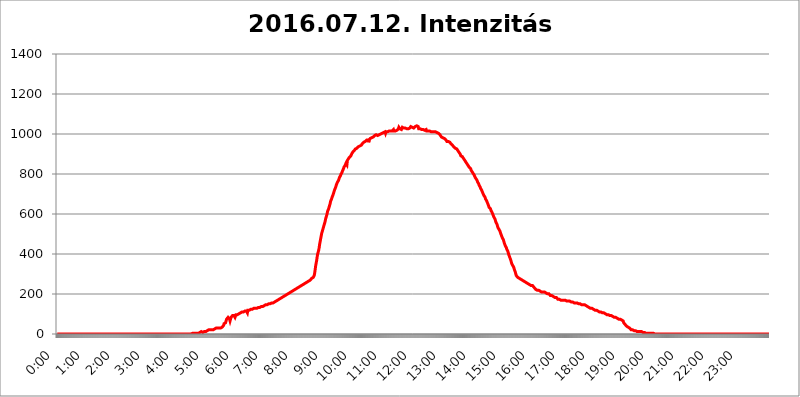
| Category | 2016.07.12. Intenzitás [W/m^2] |
|---|---|
| 0.0 | 0 |
| 0.0006944444444444445 | 0 |
| 0.001388888888888889 | 0 |
| 0.0020833333333333333 | 0 |
| 0.002777777777777778 | 0 |
| 0.003472222222222222 | 0 |
| 0.004166666666666667 | 0 |
| 0.004861111111111111 | 0 |
| 0.005555555555555556 | 0 |
| 0.0062499999999999995 | 0 |
| 0.006944444444444444 | 0 |
| 0.007638888888888889 | 0 |
| 0.008333333333333333 | 0 |
| 0.009027777777777779 | 0 |
| 0.009722222222222222 | 0 |
| 0.010416666666666666 | 0 |
| 0.011111111111111112 | 0 |
| 0.011805555555555555 | 0 |
| 0.012499999999999999 | 0 |
| 0.013194444444444444 | 0 |
| 0.013888888888888888 | 0 |
| 0.014583333333333332 | 0 |
| 0.015277777777777777 | 0 |
| 0.015972222222222224 | 0 |
| 0.016666666666666666 | 0 |
| 0.017361111111111112 | 0 |
| 0.018055555555555557 | 0 |
| 0.01875 | 0 |
| 0.019444444444444445 | 0 |
| 0.02013888888888889 | 0 |
| 0.020833333333333332 | 0 |
| 0.02152777777777778 | 0 |
| 0.022222222222222223 | 0 |
| 0.02291666666666667 | 0 |
| 0.02361111111111111 | 0 |
| 0.024305555555555556 | 0 |
| 0.024999999999999998 | 0 |
| 0.025694444444444447 | 0 |
| 0.02638888888888889 | 0 |
| 0.027083333333333334 | 0 |
| 0.027777777777777776 | 0 |
| 0.02847222222222222 | 0 |
| 0.029166666666666664 | 0 |
| 0.029861111111111113 | 0 |
| 0.030555555555555555 | 0 |
| 0.03125 | 0 |
| 0.03194444444444445 | 0 |
| 0.03263888888888889 | 0 |
| 0.03333333333333333 | 0 |
| 0.034027777777777775 | 0 |
| 0.034722222222222224 | 0 |
| 0.035416666666666666 | 0 |
| 0.036111111111111115 | 0 |
| 0.03680555555555556 | 0 |
| 0.0375 | 0 |
| 0.03819444444444444 | 0 |
| 0.03888888888888889 | 0 |
| 0.03958333333333333 | 0 |
| 0.04027777777777778 | 0 |
| 0.04097222222222222 | 0 |
| 0.041666666666666664 | 0 |
| 0.042361111111111106 | 0 |
| 0.04305555555555556 | 0 |
| 0.043750000000000004 | 0 |
| 0.044444444444444446 | 0 |
| 0.04513888888888889 | 0 |
| 0.04583333333333334 | 0 |
| 0.04652777777777778 | 0 |
| 0.04722222222222222 | 0 |
| 0.04791666666666666 | 0 |
| 0.04861111111111111 | 0 |
| 0.049305555555555554 | 0 |
| 0.049999999999999996 | 0 |
| 0.05069444444444445 | 0 |
| 0.051388888888888894 | 0 |
| 0.052083333333333336 | 0 |
| 0.05277777777777778 | 0 |
| 0.05347222222222222 | 0 |
| 0.05416666666666667 | 0 |
| 0.05486111111111111 | 0 |
| 0.05555555555555555 | 0 |
| 0.05625 | 0 |
| 0.05694444444444444 | 0 |
| 0.057638888888888885 | 0 |
| 0.05833333333333333 | 0 |
| 0.05902777777777778 | 0 |
| 0.059722222222222225 | 0 |
| 0.06041666666666667 | 0 |
| 0.061111111111111116 | 0 |
| 0.06180555555555556 | 0 |
| 0.0625 | 0 |
| 0.06319444444444444 | 0 |
| 0.06388888888888888 | 0 |
| 0.06458333333333334 | 0 |
| 0.06527777777777778 | 0 |
| 0.06597222222222222 | 0 |
| 0.06666666666666667 | 0 |
| 0.06736111111111111 | 0 |
| 0.06805555555555555 | 0 |
| 0.06874999999999999 | 0 |
| 0.06944444444444443 | 0 |
| 0.07013888888888889 | 0 |
| 0.07083333333333333 | 0 |
| 0.07152777777777779 | 0 |
| 0.07222222222222223 | 0 |
| 0.07291666666666667 | 0 |
| 0.07361111111111111 | 0 |
| 0.07430555555555556 | 0 |
| 0.075 | 0 |
| 0.07569444444444444 | 0 |
| 0.0763888888888889 | 0 |
| 0.07708333333333334 | 0 |
| 0.07777777777777778 | 0 |
| 0.07847222222222222 | 0 |
| 0.07916666666666666 | 0 |
| 0.0798611111111111 | 0 |
| 0.08055555555555556 | 0 |
| 0.08125 | 0 |
| 0.08194444444444444 | 0 |
| 0.08263888888888889 | 0 |
| 0.08333333333333333 | 0 |
| 0.08402777777777777 | 0 |
| 0.08472222222222221 | 0 |
| 0.08541666666666665 | 0 |
| 0.08611111111111112 | 0 |
| 0.08680555555555557 | 0 |
| 0.08750000000000001 | 0 |
| 0.08819444444444445 | 0 |
| 0.08888888888888889 | 0 |
| 0.08958333333333333 | 0 |
| 0.09027777777777778 | 0 |
| 0.09097222222222222 | 0 |
| 0.09166666666666667 | 0 |
| 0.09236111111111112 | 0 |
| 0.09305555555555556 | 0 |
| 0.09375 | 0 |
| 0.09444444444444444 | 0 |
| 0.09513888888888888 | 0 |
| 0.09583333333333333 | 0 |
| 0.09652777777777777 | 0 |
| 0.09722222222222222 | 0 |
| 0.09791666666666667 | 0 |
| 0.09861111111111111 | 0 |
| 0.09930555555555555 | 0 |
| 0.09999999999999999 | 0 |
| 0.10069444444444443 | 0 |
| 0.1013888888888889 | 0 |
| 0.10208333333333335 | 0 |
| 0.10277777777777779 | 0 |
| 0.10347222222222223 | 0 |
| 0.10416666666666667 | 0 |
| 0.10486111111111111 | 0 |
| 0.10555555555555556 | 0 |
| 0.10625 | 0 |
| 0.10694444444444444 | 0 |
| 0.1076388888888889 | 0 |
| 0.10833333333333334 | 0 |
| 0.10902777777777778 | 0 |
| 0.10972222222222222 | 0 |
| 0.1111111111111111 | 0 |
| 0.11180555555555556 | 0 |
| 0.11180555555555556 | 0 |
| 0.1125 | 0 |
| 0.11319444444444444 | 0 |
| 0.11388888888888889 | 0 |
| 0.11458333333333333 | 0 |
| 0.11527777777777777 | 0 |
| 0.11597222222222221 | 0 |
| 0.11666666666666665 | 0 |
| 0.1173611111111111 | 0 |
| 0.11805555555555557 | 0 |
| 0.11944444444444445 | 0 |
| 0.12013888888888889 | 0 |
| 0.12083333333333333 | 0 |
| 0.12152777777777778 | 0 |
| 0.12222222222222223 | 0 |
| 0.12291666666666667 | 0 |
| 0.12291666666666667 | 0 |
| 0.12361111111111112 | 0 |
| 0.12430555555555556 | 0 |
| 0.125 | 0 |
| 0.12569444444444444 | 0 |
| 0.12638888888888888 | 0 |
| 0.12708333333333333 | 0 |
| 0.16875 | 0 |
| 0.12847222222222224 | 0 |
| 0.12916666666666668 | 0 |
| 0.12986111111111112 | 0 |
| 0.13055555555555556 | 0 |
| 0.13125 | 0 |
| 0.13194444444444445 | 0 |
| 0.1326388888888889 | 0 |
| 0.13333333333333333 | 0 |
| 0.13402777777777777 | 0 |
| 0.13402777777777777 | 0 |
| 0.13472222222222222 | 0 |
| 0.13541666666666666 | 0 |
| 0.1361111111111111 | 0 |
| 0.13749999999999998 | 0 |
| 0.13819444444444443 | 0 |
| 0.1388888888888889 | 0 |
| 0.13958333333333334 | 0 |
| 0.14027777777777778 | 0 |
| 0.14097222222222222 | 0 |
| 0.14166666666666666 | 0 |
| 0.1423611111111111 | 0 |
| 0.14305555555555557 | 0 |
| 0.14375000000000002 | 0 |
| 0.14444444444444446 | 0 |
| 0.1451388888888889 | 0 |
| 0.1451388888888889 | 0 |
| 0.14652777777777778 | 0 |
| 0.14722222222222223 | 0 |
| 0.14791666666666667 | 0 |
| 0.1486111111111111 | 0 |
| 0.14930555555555555 | 0 |
| 0.15 | 0 |
| 0.15069444444444444 | 0 |
| 0.15138888888888888 | 0 |
| 0.15208333333333332 | 0 |
| 0.15277777777777776 | 0 |
| 0.15347222222222223 | 0 |
| 0.15416666666666667 | 0 |
| 0.15486111111111112 | 0 |
| 0.15555555555555556 | 0 |
| 0.15625 | 0 |
| 0.15694444444444444 | 0 |
| 0.15763888888888888 | 0 |
| 0.15833333333333333 | 0 |
| 0.15902777777777777 | 0 |
| 0.15972222222222224 | 0 |
| 0.16041666666666668 | 0 |
| 0.16111111111111112 | 0 |
| 0.16180555555555556 | 0 |
| 0.1625 | 0 |
| 0.16319444444444445 | 0 |
| 0.1638888888888889 | 0 |
| 0.16458333333333333 | 0 |
| 0.16527777777777777 | 0 |
| 0.16597222222222222 | 0 |
| 0.16666666666666666 | 0 |
| 0.1673611111111111 | 0 |
| 0.16805555555555554 | 0 |
| 0.16874999999999998 | 0 |
| 0.16944444444444443 | 0 |
| 0.17013888888888887 | 0 |
| 0.1708333333333333 | 0 |
| 0.17152777777777775 | 0 |
| 0.17222222222222225 | 0 |
| 0.1729166666666667 | 0 |
| 0.17361111111111113 | 0 |
| 0.17430555555555557 | 0 |
| 0.17500000000000002 | 0 |
| 0.17569444444444446 | 0 |
| 0.1763888888888889 | 0 |
| 0.17708333333333334 | 0 |
| 0.17777777777777778 | 0 |
| 0.17847222222222223 | 0 |
| 0.17916666666666667 | 0 |
| 0.1798611111111111 | 0 |
| 0.18055555555555555 | 0 |
| 0.18125 | 0 |
| 0.18194444444444444 | 0 |
| 0.1826388888888889 | 0 |
| 0.18333333333333335 | 0 |
| 0.1840277777777778 | 0 |
| 0.18472222222222223 | 0 |
| 0.18541666666666667 | 0 |
| 0.18611111111111112 | 0 |
| 0.18680555555555556 | 0 |
| 0.1875 | 0 |
| 0.18819444444444444 | 0 |
| 0.18888888888888888 | 3.525 |
| 0.18958333333333333 | 3.525 |
| 0.19027777777777777 | 3.525 |
| 0.1909722222222222 | 3.525 |
| 0.19166666666666665 | 3.525 |
| 0.19236111111111112 | 3.525 |
| 0.19305555555555554 | 3.525 |
| 0.19375 | 3.525 |
| 0.19444444444444445 | 3.525 |
| 0.1951388888888889 | 3.525 |
| 0.19583333333333333 | 3.525 |
| 0.19652777777777777 | 3.525 |
| 0.19722222222222222 | 3.525 |
| 0.19791666666666666 | 3.525 |
| 0.1986111111111111 | 7.887 |
| 0.19930555555555554 | 7.887 |
| 0.19999999999999998 | 7.887 |
| 0.20069444444444443 | 12.257 |
| 0.20138888888888887 | 12.257 |
| 0.2020833333333333 | 12.257 |
| 0.2027777777777778 | 12.257 |
| 0.2034722222222222 | 7.887 |
| 0.2041666666666667 | 7.887 |
| 0.20486111111111113 | 7.887 |
| 0.20555555555555557 | 12.257 |
| 0.20625000000000002 | 12.257 |
| 0.20694444444444446 | 12.257 |
| 0.2076388888888889 | 12.257 |
| 0.20833333333333334 | 12.257 |
| 0.20902777777777778 | 12.257 |
| 0.20972222222222223 | 16.636 |
| 0.21041666666666667 | 16.636 |
| 0.2111111111111111 | 16.636 |
| 0.21180555555555555 | 16.636 |
| 0.2125 | 21.024 |
| 0.21319444444444444 | 21.024 |
| 0.2138888888888889 | 21.024 |
| 0.21458333333333335 | 21.024 |
| 0.2152777777777778 | 21.024 |
| 0.21597222222222223 | 21.024 |
| 0.21666666666666667 | 21.024 |
| 0.21736111111111112 | 21.024 |
| 0.21805555555555556 | 21.024 |
| 0.21875 | 21.024 |
| 0.21944444444444444 | 21.024 |
| 0.22013888888888888 | 25.419 |
| 0.22083333333333333 | 25.419 |
| 0.22152777777777777 | 25.419 |
| 0.2222222222222222 | 25.419 |
| 0.22291666666666665 | 29.823 |
| 0.2236111111111111 | 29.823 |
| 0.22430555555555556 | 29.823 |
| 0.225 | 29.823 |
| 0.22569444444444445 | 29.823 |
| 0.2263888888888889 | 29.823 |
| 0.22708333333333333 | 29.823 |
| 0.22777777777777777 | 29.823 |
| 0.22847222222222222 | 29.823 |
| 0.22916666666666666 | 29.823 |
| 0.2298611111111111 | 29.823 |
| 0.23055555555555554 | 34.234 |
| 0.23124999999999998 | 34.234 |
| 0.23194444444444443 | 38.653 |
| 0.23263888888888887 | 38.653 |
| 0.2333333333333333 | 43.079 |
| 0.2340277777777778 | 51.951 |
| 0.2347222222222222 | 56.398 |
| 0.2354166666666667 | 56.398 |
| 0.23611111111111113 | 56.398 |
| 0.23680555555555557 | 65.31 |
| 0.23750000000000002 | 74.246 |
| 0.23819444444444446 | 74.246 |
| 0.2388888888888889 | 78.722 |
| 0.23958333333333334 | 83.205 |
| 0.24027777777777778 | 78.722 |
| 0.24097222222222223 | 78.722 |
| 0.24166666666666667 | 74.246 |
| 0.2423611111111111 | 65.31 |
| 0.24305555555555555 | 74.246 |
| 0.24375 | 83.205 |
| 0.24444444444444446 | 87.692 |
| 0.24513888888888888 | 87.692 |
| 0.24583333333333335 | 92.184 |
| 0.2465277777777778 | 87.692 |
| 0.24722222222222223 | 92.184 |
| 0.24791666666666667 | 92.184 |
| 0.24861111111111112 | 87.692 |
| 0.24930555555555556 | 83.205 |
| 0.25 | 83.205 |
| 0.25069444444444444 | 96.682 |
| 0.2513888888888889 | 92.184 |
| 0.2520833333333333 | 92.184 |
| 0.25277777777777777 | 96.682 |
| 0.2534722222222222 | 96.682 |
| 0.25416666666666665 | 101.184 |
| 0.2548611111111111 | 101.184 |
| 0.2555555555555556 | 101.184 |
| 0.25625000000000003 | 105.69 |
| 0.2569444444444445 | 105.69 |
| 0.2576388888888889 | 105.69 |
| 0.25833333333333336 | 110.201 |
| 0.2590277777777778 | 110.201 |
| 0.25972222222222224 | 110.201 |
| 0.2604166666666667 | 110.201 |
| 0.2611111111111111 | 110.201 |
| 0.26180555555555557 | 110.201 |
| 0.2625 | 114.716 |
| 0.26319444444444445 | 114.716 |
| 0.2638888888888889 | 114.716 |
| 0.26458333333333334 | 114.716 |
| 0.2652777777777778 | 114.716 |
| 0.2659722222222222 | 114.716 |
| 0.26666666666666666 | 105.69 |
| 0.2673611111111111 | 119.235 |
| 0.26805555555555555 | 119.235 |
| 0.26875 | 119.235 |
| 0.26944444444444443 | 119.235 |
| 0.2701388888888889 | 119.235 |
| 0.2708333333333333 | 119.235 |
| 0.27152777777777776 | 123.758 |
| 0.2722222222222222 | 123.758 |
| 0.27291666666666664 | 123.758 |
| 0.2736111111111111 | 123.758 |
| 0.2743055555555555 | 123.758 |
| 0.27499999999999997 | 128.284 |
| 0.27569444444444446 | 128.284 |
| 0.27638888888888885 | 128.284 |
| 0.27708333333333335 | 128.284 |
| 0.2777777777777778 | 128.284 |
| 0.27847222222222223 | 128.284 |
| 0.2791666666666667 | 128.284 |
| 0.2798611111111111 | 128.284 |
| 0.28055555555555556 | 132.814 |
| 0.28125 | 132.814 |
| 0.28194444444444444 | 132.814 |
| 0.2826388888888889 | 132.814 |
| 0.2833333333333333 | 132.814 |
| 0.28402777777777777 | 132.814 |
| 0.2847222222222222 | 137.347 |
| 0.28541666666666665 | 137.347 |
| 0.28611111111111115 | 137.347 |
| 0.28680555555555554 | 137.347 |
| 0.28750000000000003 | 137.347 |
| 0.2881944444444445 | 137.347 |
| 0.2888888888888889 | 141.884 |
| 0.28958333333333336 | 141.884 |
| 0.2902777777777778 | 141.884 |
| 0.29097222222222224 | 141.884 |
| 0.2916666666666667 | 141.884 |
| 0.2923611111111111 | 146.423 |
| 0.29305555555555557 | 146.423 |
| 0.29375 | 146.423 |
| 0.29444444444444445 | 146.423 |
| 0.2951388888888889 | 146.423 |
| 0.29583333333333334 | 146.423 |
| 0.2965277777777778 | 150.964 |
| 0.2972222222222222 | 150.964 |
| 0.29791666666666666 | 150.964 |
| 0.2986111111111111 | 150.964 |
| 0.29930555555555555 | 150.964 |
| 0.3 | 155.509 |
| 0.30069444444444443 | 155.509 |
| 0.3013888888888889 | 155.509 |
| 0.3020833333333333 | 155.509 |
| 0.30277777777777776 | 155.509 |
| 0.3034722222222222 | 155.509 |
| 0.30416666666666664 | 160.056 |
| 0.3048611111111111 | 160.056 |
| 0.3055555555555555 | 160.056 |
| 0.30624999999999997 | 160.056 |
| 0.3069444444444444 | 164.605 |
| 0.3076388888888889 | 164.605 |
| 0.30833333333333335 | 164.605 |
| 0.3090277777777778 | 169.156 |
| 0.30972222222222223 | 169.156 |
| 0.3104166666666667 | 169.156 |
| 0.3111111111111111 | 173.709 |
| 0.31180555555555556 | 173.709 |
| 0.3125 | 173.709 |
| 0.31319444444444444 | 178.264 |
| 0.3138888888888889 | 178.264 |
| 0.3145833333333333 | 182.82 |
| 0.31527777777777777 | 182.82 |
| 0.3159722222222222 | 182.82 |
| 0.31666666666666665 | 182.82 |
| 0.31736111111111115 | 187.378 |
| 0.31805555555555554 | 187.378 |
| 0.31875000000000003 | 187.378 |
| 0.3194444444444445 | 191.937 |
| 0.3201388888888889 | 191.937 |
| 0.32083333333333336 | 191.937 |
| 0.3215277777777778 | 196.497 |
| 0.32222222222222224 | 196.497 |
| 0.3229166666666667 | 201.058 |
| 0.3236111111111111 | 201.058 |
| 0.32430555555555557 | 201.058 |
| 0.325 | 205.62 |
| 0.32569444444444445 | 205.62 |
| 0.3263888888888889 | 205.62 |
| 0.32708333333333334 | 210.182 |
| 0.3277777777777778 | 210.182 |
| 0.3284722222222222 | 210.182 |
| 0.32916666666666666 | 210.182 |
| 0.3298611111111111 | 214.746 |
| 0.33055555555555555 | 214.746 |
| 0.33125 | 219.309 |
| 0.33194444444444443 | 219.309 |
| 0.3326388888888889 | 219.309 |
| 0.3333333333333333 | 219.309 |
| 0.3340277777777778 | 223.873 |
| 0.3347222222222222 | 223.873 |
| 0.3354166666666667 | 228.436 |
| 0.3361111111111111 | 228.436 |
| 0.3368055555555556 | 228.436 |
| 0.33749999999999997 | 228.436 |
| 0.33819444444444446 | 233 |
| 0.33888888888888885 | 233 |
| 0.33958333333333335 | 233 |
| 0.34027777777777773 | 237.564 |
| 0.34097222222222223 | 237.564 |
| 0.3416666666666666 | 242.127 |
| 0.3423611111111111 | 242.127 |
| 0.3430555555555555 | 242.127 |
| 0.34375 | 246.689 |
| 0.3444444444444445 | 246.689 |
| 0.3451388888888889 | 246.689 |
| 0.3458333333333334 | 251.251 |
| 0.34652777777777777 | 251.251 |
| 0.34722222222222227 | 251.251 |
| 0.34791666666666665 | 251.251 |
| 0.34861111111111115 | 255.813 |
| 0.34930555555555554 | 255.813 |
| 0.35000000000000003 | 260.373 |
| 0.3506944444444444 | 260.373 |
| 0.3513888888888889 | 260.373 |
| 0.3520833333333333 | 264.932 |
| 0.3527777777777778 | 264.932 |
| 0.3534722222222222 | 269.49 |
| 0.3541666666666667 | 269.49 |
| 0.3548611111111111 | 269.49 |
| 0.35555555555555557 | 274.047 |
| 0.35625 | 274.047 |
| 0.35694444444444445 | 278.603 |
| 0.3576388888888889 | 278.603 |
| 0.35833333333333334 | 278.603 |
| 0.3590277777777778 | 283.156 |
| 0.3597222222222222 | 287.709 |
| 0.36041666666666666 | 292.259 |
| 0.3611111111111111 | 305.898 |
| 0.36180555555555555 | 324.052 |
| 0.3625 | 342.162 |
| 0.36319444444444443 | 355.712 |
| 0.3638888888888889 | 369.23 |
| 0.3645833333333333 | 387.202 |
| 0.3652777777777778 | 400.638 |
| 0.3659722222222222 | 409.574 |
| 0.3666666666666667 | 418.492 |
| 0.3673611111111111 | 431.833 |
| 0.3680555555555556 | 449.551 |
| 0.36874999999999997 | 462.786 |
| 0.36944444444444446 | 475.972 |
| 0.37013888888888885 | 489.108 |
| 0.37083333333333335 | 502.192 |
| 0.37152777777777773 | 510.885 |
| 0.37222222222222223 | 519.555 |
| 0.3729166666666666 | 528.2 |
| 0.3736111111111111 | 536.82 |
| 0.3743055555555555 | 545.416 |
| 0.375 | 553.986 |
| 0.3756944444444445 | 562.53 |
| 0.3763888888888889 | 575.299 |
| 0.3770833333333334 | 583.779 |
| 0.37777777777777777 | 592.233 |
| 0.37847222222222227 | 600.661 |
| 0.37916666666666665 | 613.252 |
| 0.37986111111111115 | 617.436 |
| 0.38055555555555554 | 625.784 |
| 0.38125000000000003 | 634.105 |
| 0.3819444444444444 | 642.4 |
| 0.3826388888888889 | 650.667 |
| 0.3833333333333333 | 663.019 |
| 0.3840277777777778 | 667.123 |
| 0.3847222222222222 | 675.311 |
| 0.3854166666666667 | 683.473 |
| 0.3861111111111111 | 687.544 |
| 0.38680555555555557 | 695.666 |
| 0.3875 | 703.762 |
| 0.38819444444444445 | 711.832 |
| 0.3888888888888889 | 719.877 |
| 0.38958333333333334 | 723.889 |
| 0.3902777777777778 | 731.896 |
| 0.3909722222222222 | 735.89 |
| 0.39166666666666666 | 747.834 |
| 0.3923611111111111 | 751.803 |
| 0.39305555555555555 | 759.723 |
| 0.39375 | 763.674 |
| 0.39444444444444443 | 767.62 |
| 0.3951388888888889 | 775.492 |
| 0.3958333333333333 | 783.342 |
| 0.3965277777777778 | 787.258 |
| 0.3972222222222222 | 791.169 |
| 0.3979166666666667 | 798.974 |
| 0.3986111111111111 | 802.868 |
| 0.3993055555555556 | 806.757 |
| 0.39999999999999997 | 814.519 |
| 0.40069444444444446 | 818.392 |
| 0.40138888888888885 | 826.123 |
| 0.40208333333333335 | 833.834 |
| 0.40277777777777773 | 837.682 |
| 0.40347222222222223 | 841.526 |
| 0.4041666666666666 | 845.365 |
| 0.4048611111111111 | 853.029 |
| 0.4055555555555555 | 853.029 |
| 0.40625 | 845.365 |
| 0.4069444444444445 | 868.305 |
| 0.4076388888888889 | 872.114 |
| 0.4083333333333334 | 875.918 |
| 0.40902777777777777 | 875.918 |
| 0.40972222222222227 | 883.516 |
| 0.41041666666666665 | 883.516 |
| 0.41111111111111115 | 887.309 |
| 0.41180555555555554 | 891.099 |
| 0.41250000000000003 | 894.885 |
| 0.4131944444444444 | 902.447 |
| 0.4138888888888889 | 906.223 |
| 0.4145833333333333 | 909.996 |
| 0.4152777777777778 | 913.766 |
| 0.4159722222222222 | 913.766 |
| 0.4166666666666667 | 917.534 |
| 0.4173611111111111 | 921.298 |
| 0.41805555555555557 | 925.06 |
| 0.41875 | 928.819 |
| 0.41944444444444445 | 925.06 |
| 0.4201388888888889 | 928.819 |
| 0.42083333333333334 | 928.819 |
| 0.4215277777777778 | 932.576 |
| 0.4222222222222222 | 936.33 |
| 0.42291666666666666 | 940.082 |
| 0.4236111111111111 | 940.082 |
| 0.42430555555555555 | 940.082 |
| 0.425 | 943.832 |
| 0.42569444444444443 | 943.832 |
| 0.4263888888888889 | 943.832 |
| 0.4270833333333333 | 947.58 |
| 0.4277777777777778 | 951.327 |
| 0.4284722222222222 | 951.327 |
| 0.4291666666666667 | 955.071 |
| 0.4298611111111111 | 958.814 |
| 0.4305555555555556 | 962.555 |
| 0.43124999999999997 | 962.555 |
| 0.43194444444444446 | 962.555 |
| 0.43263888888888885 | 962.555 |
| 0.43333333333333335 | 966.295 |
| 0.43402777777777773 | 970.034 |
| 0.43472222222222223 | 970.034 |
| 0.4354166666666666 | 973.772 |
| 0.4361111111111111 | 970.034 |
| 0.4368055555555555 | 958.814 |
| 0.4375 | 970.034 |
| 0.4381944444444445 | 973.772 |
| 0.4388888888888889 | 977.508 |
| 0.4395833333333334 | 981.244 |
| 0.44027777777777777 | 981.244 |
| 0.44097222222222227 | 981.244 |
| 0.44166666666666665 | 984.98 |
| 0.44236111111111115 | 984.98 |
| 0.44305555555555554 | 984.98 |
| 0.44375000000000003 | 988.714 |
| 0.4444444444444444 | 988.714 |
| 0.4451388888888889 | 992.448 |
| 0.4458333333333333 | 992.448 |
| 0.4465277777777778 | 996.182 |
| 0.4472222222222222 | 996.182 |
| 0.4479166666666667 | 992.448 |
| 0.4486111111111111 | 992.448 |
| 0.44930555555555557 | 992.448 |
| 0.45 | 996.182 |
| 0.45069444444444445 | 996.182 |
| 0.4513888888888889 | 996.182 |
| 0.45208333333333334 | 992.448 |
| 0.4527777777777778 | 992.448 |
| 0.4534722222222222 | 999.916 |
| 0.45416666666666666 | 1003.65 |
| 0.4548611111111111 | 999.916 |
| 0.45555555555555555 | 1003.65 |
| 0.45625 | 1007.383 |
| 0.45694444444444443 | 1007.383 |
| 0.4576388888888889 | 1007.383 |
| 0.4583333333333333 | 1007.383 |
| 0.4590277777777778 | 1007.383 |
| 0.4597222222222222 | 1011.118 |
| 0.4604166666666667 | 1003.65 |
| 0.4611111111111111 | 1011.118 |
| 0.4618055555555556 | 1011.118 |
| 0.46249999999999997 | 1014.852 |
| 0.46319444444444446 | 1011.118 |
| 0.46388888888888885 | 1011.118 |
| 0.46458333333333335 | 1014.852 |
| 0.46527777777777773 | 1014.852 |
| 0.46597222222222223 | 1014.852 |
| 0.4666666666666666 | 1014.852 |
| 0.4673611111111111 | 1014.852 |
| 0.4680555555555555 | 1014.852 |
| 0.46875 | 1014.852 |
| 0.4694444444444445 | 1014.852 |
| 0.4701388888888889 | 1011.118 |
| 0.4708333333333334 | 1018.587 |
| 0.47152777777777777 | 1022.323 |
| 0.47222222222222227 | 1014.852 |
| 0.47291666666666665 | 1018.587 |
| 0.47361111111111115 | 1014.852 |
| 0.47430555555555554 | 1014.852 |
| 0.47500000000000003 | 1011.118 |
| 0.4756944444444444 | 1011.118 |
| 0.4763888888888889 | 1018.587 |
| 0.4770833333333333 | 1018.587 |
| 0.4777777777777778 | 1018.587 |
| 0.4784722222222222 | 1026.06 |
| 0.4791666666666667 | 1033.537 |
| 0.4798611111111111 | 1029.798 |
| 0.48055555555555557 | 1026.06 |
| 0.48125 | 1026.06 |
| 0.48194444444444445 | 1026.06 |
| 0.4826388888888889 | 1022.323 |
| 0.48333333333333334 | 1022.323 |
| 0.4840277777777778 | 1033.537 |
| 0.4847222222222222 | 1033.537 |
| 0.48541666666666666 | 1029.798 |
| 0.4861111111111111 | 1029.798 |
| 0.48680555555555555 | 1029.798 |
| 0.4875 | 1033.537 |
| 0.48819444444444443 | 1029.798 |
| 0.4888888888888889 | 1026.06 |
| 0.4895833333333333 | 1026.06 |
| 0.4902777777777778 | 1026.06 |
| 0.4909722222222222 | 1026.06 |
| 0.4916666666666667 | 1026.06 |
| 0.4923611111111111 | 1026.06 |
| 0.4930555555555556 | 1029.798 |
| 0.49374999999999997 | 1029.798 |
| 0.49444444444444446 | 1029.798 |
| 0.49513888888888885 | 1033.537 |
| 0.49583333333333335 | 1037.277 |
| 0.49652777777777773 | 1037.277 |
| 0.49722222222222223 | 1037.277 |
| 0.4979166666666666 | 1033.537 |
| 0.4986111111111111 | 1029.798 |
| 0.4993055555555555 | 1029.798 |
| 0.5 | 1029.798 |
| 0.5006944444444444 | 1033.537 |
| 0.5013888888888889 | 1033.537 |
| 0.5020833333333333 | 1037.277 |
| 0.5027777777777778 | 1041.019 |
| 0.5034722222222222 | 1041.019 |
| 0.5041666666666667 | 1041.019 |
| 0.5048611111111111 | 1041.019 |
| 0.5055555555555555 | 1041.019 |
| 0.50625 | 1037.277 |
| 0.5069444444444444 | 1026.06 |
| 0.5076388888888889 | 1026.06 |
| 0.5083333333333333 | 1026.06 |
| 0.5090277777777777 | 1026.06 |
| 0.5097222222222222 | 1022.323 |
| 0.5104166666666666 | 1022.323 |
| 0.5111111111111112 | 1022.323 |
| 0.5118055555555555 | 1022.323 |
| 0.5125000000000001 | 1018.587 |
| 0.5131944444444444 | 1022.323 |
| 0.513888888888889 | 1018.587 |
| 0.5145833333333333 | 1018.587 |
| 0.5152777777777778 | 1018.587 |
| 0.5159722222222222 | 1022.323 |
| 0.5166666666666667 | 1022.323 |
| 0.517361111111111 | 1022.323 |
| 0.5180555555555556 | 1014.852 |
| 0.5187499999999999 | 1014.852 |
| 0.5194444444444445 | 1011.118 |
| 0.5201388888888888 | 1014.852 |
| 0.5208333333333334 | 1014.852 |
| 0.5215277777777778 | 1014.852 |
| 0.5222222222222223 | 1014.852 |
| 0.5229166666666667 | 1014.852 |
| 0.5236111111111111 | 1018.587 |
| 0.5243055555555556 | 1011.118 |
| 0.525 | 1007.383 |
| 0.5256944444444445 | 1011.118 |
| 0.5263888888888889 | 1011.118 |
| 0.5270833333333333 | 1007.383 |
| 0.5277777777777778 | 1011.118 |
| 0.5284722222222222 | 1011.118 |
| 0.5291666666666667 | 1007.383 |
| 0.5298611111111111 | 1007.383 |
| 0.5305555555555556 | 1011.118 |
| 0.53125 | 1007.383 |
| 0.5319444444444444 | 1007.383 |
| 0.5326388888888889 | 1007.383 |
| 0.5333333333333333 | 1007.383 |
| 0.5340277777777778 | 1003.65 |
| 0.5347222222222222 | 1003.65 |
| 0.5354166666666667 | 999.916 |
| 0.5361111111111111 | 999.916 |
| 0.5368055555555555 | 996.182 |
| 0.5375 | 992.448 |
| 0.5381944444444444 | 992.448 |
| 0.5388888888888889 | 984.98 |
| 0.5395833333333333 | 981.244 |
| 0.5402777777777777 | 981.244 |
| 0.5409722222222222 | 981.244 |
| 0.5416666666666666 | 981.244 |
| 0.5423611111111112 | 977.508 |
| 0.5430555555555555 | 977.508 |
| 0.5437500000000001 | 977.508 |
| 0.5444444444444444 | 973.772 |
| 0.545138888888889 | 970.034 |
| 0.5458333333333333 | 970.034 |
| 0.5465277777777778 | 962.555 |
| 0.5472222222222222 | 962.555 |
| 0.5479166666666667 | 962.555 |
| 0.548611111111111 | 962.555 |
| 0.5493055555555556 | 958.814 |
| 0.5499999999999999 | 962.555 |
| 0.5506944444444445 | 958.814 |
| 0.5513888888888888 | 955.071 |
| 0.5520833333333334 | 951.327 |
| 0.5527777777777778 | 947.58 |
| 0.5534722222222223 | 947.58 |
| 0.5541666666666667 | 943.832 |
| 0.5548611111111111 | 940.082 |
| 0.5555555555555556 | 940.082 |
| 0.55625 | 936.33 |
| 0.5569444444444445 | 936.33 |
| 0.5576388888888889 | 932.576 |
| 0.5583333333333333 | 928.819 |
| 0.5590277777777778 | 925.06 |
| 0.5597222222222222 | 925.06 |
| 0.5604166666666667 | 925.06 |
| 0.5611111111111111 | 921.298 |
| 0.5618055555555556 | 917.534 |
| 0.5625 | 913.766 |
| 0.5631944444444444 | 909.996 |
| 0.5638888888888889 | 913.766 |
| 0.5645833333333333 | 906.223 |
| 0.5652777777777778 | 898.668 |
| 0.5659722222222222 | 891.099 |
| 0.5666666666666667 | 891.099 |
| 0.5673611111111111 | 891.099 |
| 0.5680555555555555 | 887.309 |
| 0.56875 | 883.516 |
| 0.5694444444444444 | 879.719 |
| 0.5701388888888889 | 875.918 |
| 0.5708333333333333 | 872.114 |
| 0.5715277777777777 | 868.305 |
| 0.5722222222222222 | 864.493 |
| 0.5729166666666666 | 860.676 |
| 0.5736111111111112 | 856.855 |
| 0.5743055555555555 | 853.029 |
| 0.5750000000000001 | 849.199 |
| 0.5756944444444444 | 845.365 |
| 0.576388888888889 | 841.526 |
| 0.5770833333333333 | 837.682 |
| 0.5777777777777778 | 833.834 |
| 0.5784722222222222 | 833.834 |
| 0.5791666666666667 | 829.981 |
| 0.579861111111111 | 826.123 |
| 0.5805555555555556 | 818.392 |
| 0.5812499999999999 | 814.519 |
| 0.5819444444444445 | 810.641 |
| 0.5826388888888888 | 806.757 |
| 0.5833333333333334 | 802.868 |
| 0.5840277777777778 | 798.974 |
| 0.5847222222222223 | 795.074 |
| 0.5854166666666667 | 791.169 |
| 0.5861111111111111 | 783.342 |
| 0.5868055555555556 | 779.42 |
| 0.5875 | 775.492 |
| 0.5881944444444445 | 771.559 |
| 0.5888888888888889 | 767.62 |
| 0.5895833333333333 | 759.723 |
| 0.5902777777777778 | 755.766 |
| 0.5909722222222222 | 751.803 |
| 0.5916666666666667 | 743.859 |
| 0.5923611111111111 | 739.877 |
| 0.5930555555555556 | 735.89 |
| 0.59375 | 727.896 |
| 0.5944444444444444 | 723.889 |
| 0.5951388888888889 | 719.877 |
| 0.5958333333333333 | 715.858 |
| 0.5965277777777778 | 707.8 |
| 0.5972222222222222 | 703.762 |
| 0.5979166666666667 | 695.666 |
| 0.5986111111111111 | 691.608 |
| 0.5993055555555555 | 691.608 |
| 0.6 | 683.473 |
| 0.6006944444444444 | 675.311 |
| 0.6013888888888889 | 671.22 |
| 0.6020833333333333 | 667.123 |
| 0.6027777777777777 | 663.019 |
| 0.6034722222222222 | 654.791 |
| 0.6041666666666666 | 650.667 |
| 0.6048611111111112 | 642.4 |
| 0.6055555555555555 | 634.105 |
| 0.6062500000000001 | 634.105 |
| 0.6069444444444444 | 629.948 |
| 0.607638888888889 | 625.784 |
| 0.6083333333333333 | 617.436 |
| 0.6090277777777778 | 613.252 |
| 0.6097222222222222 | 609.062 |
| 0.6104166666666667 | 604.864 |
| 0.611111111111111 | 596.45 |
| 0.6118055555555556 | 592.233 |
| 0.6124999999999999 | 583.779 |
| 0.6131944444444445 | 579.542 |
| 0.6138888888888888 | 575.299 |
| 0.6145833333333334 | 566.793 |
| 0.6152777777777778 | 558.261 |
| 0.6159722222222223 | 553.986 |
| 0.6166666666666667 | 549.704 |
| 0.6173611111111111 | 541.121 |
| 0.6180555555555556 | 532.513 |
| 0.61875 | 528.2 |
| 0.6194444444444445 | 523.88 |
| 0.6201388888888889 | 519.555 |
| 0.6208333333333333 | 515.223 |
| 0.6215277777777778 | 506.542 |
| 0.6222222222222222 | 502.192 |
| 0.6229166666666667 | 493.475 |
| 0.6236111111111111 | 489.108 |
| 0.6243055555555556 | 480.356 |
| 0.625 | 475.972 |
| 0.6256944444444444 | 471.582 |
| 0.6263888888888889 | 462.786 |
| 0.6270833333333333 | 453.968 |
| 0.6277777777777778 | 449.551 |
| 0.6284722222222222 | 440.702 |
| 0.6291666666666667 | 436.27 |
| 0.6298611111111111 | 431.833 |
| 0.6305555555555555 | 422.943 |
| 0.63125 | 418.492 |
| 0.6319444444444444 | 414.035 |
| 0.6326388888888889 | 405.108 |
| 0.6333333333333333 | 396.164 |
| 0.6340277777777777 | 391.685 |
| 0.6347222222222222 | 382.715 |
| 0.6354166666666666 | 378.224 |
| 0.6361111111111112 | 369.23 |
| 0.6368055555555555 | 360.221 |
| 0.6375000000000001 | 351.198 |
| 0.6381944444444444 | 346.682 |
| 0.638888888888889 | 342.162 |
| 0.6395833333333333 | 337.639 |
| 0.6402777777777778 | 333.113 |
| 0.6409722222222222 | 324.052 |
| 0.6416666666666667 | 319.517 |
| 0.642361111111111 | 310.44 |
| 0.6430555555555556 | 301.354 |
| 0.6437499999999999 | 292.259 |
| 0.6444444444444445 | 287.709 |
| 0.6451388888888888 | 287.709 |
| 0.6458333333333334 | 283.156 |
| 0.6465277777777778 | 283.156 |
| 0.6472222222222223 | 278.603 |
| 0.6479166666666667 | 278.603 |
| 0.6486111111111111 | 278.603 |
| 0.6493055555555556 | 274.047 |
| 0.65 | 274.047 |
| 0.6506944444444445 | 274.047 |
| 0.6513888888888889 | 274.047 |
| 0.6520833333333333 | 269.49 |
| 0.6527777777777778 | 269.49 |
| 0.6534722222222222 | 269.49 |
| 0.6541666666666667 | 264.932 |
| 0.6548611111111111 | 264.932 |
| 0.6555555555555556 | 264.932 |
| 0.65625 | 260.373 |
| 0.6569444444444444 | 260.373 |
| 0.6576388888888889 | 260.373 |
| 0.6583333333333333 | 255.813 |
| 0.6590277777777778 | 255.813 |
| 0.6597222222222222 | 255.813 |
| 0.6604166666666667 | 251.251 |
| 0.6611111111111111 | 251.251 |
| 0.6618055555555555 | 251.251 |
| 0.6625 | 246.689 |
| 0.6631944444444444 | 246.689 |
| 0.6638888888888889 | 242.127 |
| 0.6645833333333333 | 242.127 |
| 0.6652777777777777 | 242.127 |
| 0.6659722222222222 | 242.127 |
| 0.6666666666666666 | 242.127 |
| 0.6673611111111111 | 242.127 |
| 0.6680555555555556 | 242.127 |
| 0.6687500000000001 | 233 |
| 0.6694444444444444 | 228.436 |
| 0.6701388888888888 | 228.436 |
| 0.6708333333333334 | 223.873 |
| 0.6715277777777778 | 223.873 |
| 0.6722222222222222 | 219.309 |
| 0.6729166666666666 | 219.309 |
| 0.6736111111111112 | 219.309 |
| 0.6743055555555556 | 214.746 |
| 0.6749999999999999 | 219.309 |
| 0.6756944444444444 | 214.746 |
| 0.6763888888888889 | 214.746 |
| 0.6770833333333334 | 214.746 |
| 0.6777777777777777 | 214.746 |
| 0.6784722222222223 | 214.746 |
| 0.6791666666666667 | 210.182 |
| 0.6798611111111111 | 210.182 |
| 0.6805555555555555 | 210.182 |
| 0.68125 | 210.182 |
| 0.6819444444444445 | 210.182 |
| 0.6826388888888889 | 210.182 |
| 0.6833333333333332 | 210.182 |
| 0.6840277777777778 | 210.182 |
| 0.6847222222222222 | 205.62 |
| 0.6854166666666667 | 205.62 |
| 0.686111111111111 | 205.62 |
| 0.6868055555555556 | 205.62 |
| 0.6875 | 201.058 |
| 0.6881944444444444 | 201.058 |
| 0.688888888888889 | 201.058 |
| 0.6895833333333333 | 201.058 |
| 0.6902777777777778 | 196.497 |
| 0.6909722222222222 | 196.497 |
| 0.6916666666666668 | 191.937 |
| 0.6923611111111111 | 191.937 |
| 0.6930555555555555 | 191.937 |
| 0.69375 | 191.937 |
| 0.6944444444444445 | 187.378 |
| 0.6951388888888889 | 187.378 |
| 0.6958333333333333 | 187.378 |
| 0.6965277777777777 | 187.378 |
| 0.6972222222222223 | 182.82 |
| 0.6979166666666666 | 182.82 |
| 0.6986111111111111 | 182.82 |
| 0.6993055555555556 | 182.82 |
| 0.7000000000000001 | 182.82 |
| 0.7006944444444444 | 178.264 |
| 0.7013888888888888 | 178.264 |
| 0.7020833333333334 | 173.709 |
| 0.7027777777777778 | 173.709 |
| 0.7034722222222222 | 173.709 |
| 0.7041666666666666 | 173.709 |
| 0.7048611111111112 | 169.156 |
| 0.7055555555555556 | 169.156 |
| 0.7062499999999999 | 169.156 |
| 0.7069444444444444 | 169.156 |
| 0.7076388888888889 | 169.156 |
| 0.7083333333333334 | 169.156 |
| 0.7090277777777777 | 169.156 |
| 0.7097222222222223 | 169.156 |
| 0.7104166666666667 | 169.156 |
| 0.7111111111111111 | 164.605 |
| 0.7118055555555555 | 164.605 |
| 0.7125 | 169.156 |
| 0.7131944444444445 | 164.605 |
| 0.7138888888888889 | 164.605 |
| 0.7145833333333332 | 164.605 |
| 0.7152777777777778 | 164.605 |
| 0.7159722222222222 | 164.605 |
| 0.7166666666666667 | 164.605 |
| 0.717361111111111 | 164.605 |
| 0.7180555555555556 | 164.605 |
| 0.71875 | 164.605 |
| 0.7194444444444444 | 160.056 |
| 0.720138888888889 | 160.056 |
| 0.7208333333333333 | 160.056 |
| 0.7215277777777778 | 160.056 |
| 0.7222222222222222 | 160.056 |
| 0.7229166666666668 | 160.056 |
| 0.7236111111111111 | 160.056 |
| 0.7243055555555555 | 155.509 |
| 0.725 | 155.509 |
| 0.7256944444444445 | 155.509 |
| 0.7263888888888889 | 155.509 |
| 0.7270833333333333 | 155.509 |
| 0.7277777777777777 | 155.509 |
| 0.7284722222222223 | 155.509 |
| 0.7291666666666666 | 155.509 |
| 0.7298611111111111 | 150.964 |
| 0.7305555555555556 | 150.964 |
| 0.7312500000000001 | 150.964 |
| 0.7319444444444444 | 150.964 |
| 0.7326388888888888 | 150.964 |
| 0.7333333333333334 | 150.964 |
| 0.7340277777777778 | 150.964 |
| 0.7347222222222222 | 146.423 |
| 0.7354166666666666 | 146.423 |
| 0.7361111111111112 | 146.423 |
| 0.7368055555555556 | 146.423 |
| 0.7374999999999999 | 146.423 |
| 0.7381944444444444 | 146.423 |
| 0.7388888888888889 | 146.423 |
| 0.7395833333333334 | 146.423 |
| 0.7402777777777777 | 141.884 |
| 0.7409722222222223 | 141.884 |
| 0.7416666666666667 | 141.884 |
| 0.7423611111111111 | 137.347 |
| 0.7430555555555555 | 137.347 |
| 0.74375 | 137.347 |
| 0.7444444444444445 | 137.347 |
| 0.7451388888888889 | 132.814 |
| 0.7458333333333332 | 132.814 |
| 0.7465277777777778 | 132.814 |
| 0.7472222222222222 | 132.814 |
| 0.7479166666666667 | 128.284 |
| 0.748611111111111 | 128.284 |
| 0.7493055555555556 | 128.284 |
| 0.75 | 128.284 |
| 0.7506944444444444 | 123.758 |
| 0.751388888888889 | 123.758 |
| 0.7520833333333333 | 123.758 |
| 0.7527777777777778 | 123.758 |
| 0.7534722222222222 | 119.235 |
| 0.7541666666666668 | 119.235 |
| 0.7548611111111111 | 119.235 |
| 0.7555555555555555 | 119.235 |
| 0.75625 | 119.235 |
| 0.7569444444444445 | 114.716 |
| 0.7576388888888889 | 114.716 |
| 0.7583333333333333 | 114.716 |
| 0.7590277777777777 | 114.716 |
| 0.7597222222222223 | 114.716 |
| 0.7604166666666666 | 110.201 |
| 0.7611111111111111 | 110.201 |
| 0.7618055555555556 | 110.201 |
| 0.7625000000000001 | 110.201 |
| 0.7631944444444444 | 110.201 |
| 0.7638888888888888 | 105.69 |
| 0.7645833333333334 | 105.69 |
| 0.7652777777777778 | 105.69 |
| 0.7659722222222222 | 105.69 |
| 0.7666666666666666 | 105.69 |
| 0.7673611111111112 | 101.184 |
| 0.7680555555555556 | 101.184 |
| 0.7687499999999999 | 101.184 |
| 0.7694444444444444 | 101.184 |
| 0.7701388888888889 | 96.682 |
| 0.7708333333333334 | 96.682 |
| 0.7715277777777777 | 96.682 |
| 0.7722222222222223 | 96.682 |
| 0.7729166666666667 | 96.682 |
| 0.7736111111111111 | 92.184 |
| 0.7743055555555555 | 92.184 |
| 0.775 | 92.184 |
| 0.7756944444444445 | 92.184 |
| 0.7763888888888889 | 92.184 |
| 0.7770833333333332 | 92.184 |
| 0.7777777777777778 | 87.692 |
| 0.7784722222222222 | 87.692 |
| 0.7791666666666667 | 87.692 |
| 0.779861111111111 | 87.692 |
| 0.7805555555555556 | 83.205 |
| 0.78125 | 83.205 |
| 0.7819444444444444 | 83.205 |
| 0.782638888888889 | 83.205 |
| 0.7833333333333333 | 83.205 |
| 0.7840277777777778 | 83.205 |
| 0.7847222222222222 | 78.722 |
| 0.7854166666666668 | 78.722 |
| 0.7861111111111111 | 78.722 |
| 0.7868055555555555 | 78.722 |
| 0.7875 | 74.246 |
| 0.7881944444444445 | 74.246 |
| 0.7888888888888889 | 74.246 |
| 0.7895833333333333 | 74.246 |
| 0.7902777777777777 | 69.775 |
| 0.7909722222222223 | 69.775 |
| 0.7916666666666666 | 69.775 |
| 0.7923611111111111 | 69.775 |
| 0.7930555555555556 | 65.31 |
| 0.7937500000000001 | 65.31 |
| 0.7944444444444444 | 56.398 |
| 0.7951388888888888 | 56.398 |
| 0.7958333333333334 | 51.951 |
| 0.7965277777777778 | 47.511 |
| 0.7972222222222222 | 43.079 |
| 0.7979166666666666 | 43.079 |
| 0.7986111111111112 | 38.653 |
| 0.7993055555555556 | 38.653 |
| 0.7999999999999999 | 34.234 |
| 0.8006944444444444 | 34.234 |
| 0.8013888888888889 | 29.823 |
| 0.8020833333333334 | 29.823 |
| 0.8027777777777777 | 29.823 |
| 0.8034722222222223 | 25.419 |
| 0.8041666666666667 | 25.419 |
| 0.8048611111111111 | 21.024 |
| 0.8055555555555555 | 21.024 |
| 0.80625 | 21.024 |
| 0.8069444444444445 | 21.024 |
| 0.8076388888888889 | 16.636 |
| 0.8083333333333332 | 16.636 |
| 0.8090277777777778 | 16.636 |
| 0.8097222222222222 | 16.636 |
| 0.8104166666666667 | 16.636 |
| 0.811111111111111 | 16.636 |
| 0.8118055555555556 | 12.257 |
| 0.8125 | 12.257 |
| 0.8131944444444444 | 12.257 |
| 0.813888888888889 | 12.257 |
| 0.8145833333333333 | 12.257 |
| 0.8152777777777778 | 12.257 |
| 0.8159722222222222 | 12.257 |
| 0.8166666666666668 | 12.257 |
| 0.8173611111111111 | 12.257 |
| 0.8180555555555555 | 12.257 |
| 0.81875 | 7.887 |
| 0.8194444444444445 | 12.257 |
| 0.8201388888888889 | 7.887 |
| 0.8208333333333333 | 7.887 |
| 0.8215277777777777 | 7.887 |
| 0.8222222222222223 | 7.887 |
| 0.8229166666666666 | 7.887 |
| 0.8236111111111111 | 7.887 |
| 0.8243055555555556 | 7.887 |
| 0.8250000000000001 | 7.887 |
| 0.8256944444444444 | 3.525 |
| 0.8263888888888888 | 3.525 |
| 0.8270833333333334 | 3.525 |
| 0.8277777777777778 | 3.525 |
| 0.8284722222222222 | 3.525 |
| 0.8291666666666666 | 3.525 |
| 0.8298611111111112 | 3.525 |
| 0.8305555555555556 | 3.525 |
| 0.8312499999999999 | 3.525 |
| 0.8319444444444444 | 3.525 |
| 0.8326388888888889 | 3.525 |
| 0.8333333333333334 | 3.525 |
| 0.8340277777777777 | 3.525 |
| 0.8347222222222223 | 3.525 |
| 0.8354166666666667 | 3.525 |
| 0.8361111111111111 | 3.525 |
| 0.8368055555555555 | 0 |
| 0.8375 | 3.525 |
| 0.8381944444444445 | 0 |
| 0.8388888888888889 | 0 |
| 0.8395833333333332 | 0 |
| 0.8402777777777778 | 0 |
| 0.8409722222222222 | 0 |
| 0.8416666666666667 | 0 |
| 0.842361111111111 | 0 |
| 0.8430555555555556 | 0 |
| 0.84375 | 0 |
| 0.8444444444444444 | 0 |
| 0.845138888888889 | 0 |
| 0.8458333333333333 | 0 |
| 0.8465277777777778 | 0 |
| 0.8472222222222222 | 0 |
| 0.8479166666666668 | 0 |
| 0.8486111111111111 | 0 |
| 0.8493055555555555 | 0 |
| 0.85 | 0 |
| 0.8506944444444445 | 0 |
| 0.8513888888888889 | 0 |
| 0.8520833333333333 | 0 |
| 0.8527777777777777 | 0 |
| 0.8534722222222223 | 0 |
| 0.8541666666666666 | 0 |
| 0.8548611111111111 | 0 |
| 0.8555555555555556 | 0 |
| 0.8562500000000001 | 0 |
| 0.8569444444444444 | 0 |
| 0.8576388888888888 | 0 |
| 0.8583333333333334 | 0 |
| 0.8590277777777778 | 0 |
| 0.8597222222222222 | 0 |
| 0.8604166666666666 | 0 |
| 0.8611111111111112 | 0 |
| 0.8618055555555556 | 0 |
| 0.8624999999999999 | 0 |
| 0.8631944444444444 | 0 |
| 0.8638888888888889 | 0 |
| 0.8645833333333334 | 0 |
| 0.8652777777777777 | 0 |
| 0.8659722222222223 | 0 |
| 0.8666666666666667 | 0 |
| 0.8673611111111111 | 0 |
| 0.8680555555555555 | 0 |
| 0.86875 | 0 |
| 0.8694444444444445 | 0 |
| 0.8701388888888889 | 0 |
| 0.8708333333333332 | 0 |
| 0.8715277777777778 | 0 |
| 0.8722222222222222 | 0 |
| 0.8729166666666667 | 0 |
| 0.873611111111111 | 0 |
| 0.8743055555555556 | 0 |
| 0.875 | 0 |
| 0.8756944444444444 | 0 |
| 0.876388888888889 | 0 |
| 0.8770833333333333 | 0 |
| 0.8777777777777778 | 0 |
| 0.8784722222222222 | 0 |
| 0.8791666666666668 | 0 |
| 0.8798611111111111 | 0 |
| 0.8805555555555555 | 0 |
| 0.88125 | 0 |
| 0.8819444444444445 | 0 |
| 0.8826388888888889 | 0 |
| 0.8833333333333333 | 0 |
| 0.8840277777777777 | 0 |
| 0.8847222222222223 | 0 |
| 0.8854166666666666 | 0 |
| 0.8861111111111111 | 0 |
| 0.8868055555555556 | 0 |
| 0.8875000000000001 | 0 |
| 0.8881944444444444 | 0 |
| 0.8888888888888888 | 0 |
| 0.8895833333333334 | 0 |
| 0.8902777777777778 | 0 |
| 0.8909722222222222 | 0 |
| 0.8916666666666666 | 0 |
| 0.8923611111111112 | 0 |
| 0.8930555555555556 | 0 |
| 0.8937499999999999 | 0 |
| 0.8944444444444444 | 0 |
| 0.8951388888888889 | 0 |
| 0.8958333333333334 | 0 |
| 0.8965277777777777 | 0 |
| 0.8972222222222223 | 0 |
| 0.8979166666666667 | 0 |
| 0.8986111111111111 | 0 |
| 0.8993055555555555 | 0 |
| 0.9 | 0 |
| 0.9006944444444445 | 0 |
| 0.9013888888888889 | 0 |
| 0.9020833333333332 | 0 |
| 0.9027777777777778 | 0 |
| 0.9034722222222222 | 0 |
| 0.9041666666666667 | 0 |
| 0.904861111111111 | 0 |
| 0.9055555555555556 | 0 |
| 0.90625 | 0 |
| 0.9069444444444444 | 0 |
| 0.907638888888889 | 0 |
| 0.9083333333333333 | 0 |
| 0.9090277777777778 | 0 |
| 0.9097222222222222 | 0 |
| 0.9104166666666668 | 0 |
| 0.9111111111111111 | 0 |
| 0.9118055555555555 | 0 |
| 0.9125 | 0 |
| 0.9131944444444445 | 0 |
| 0.9138888888888889 | 0 |
| 0.9145833333333333 | 0 |
| 0.9152777777777777 | 0 |
| 0.9159722222222223 | 0 |
| 0.9166666666666666 | 0 |
| 0.9173611111111111 | 0 |
| 0.9180555555555556 | 0 |
| 0.9187500000000001 | 0 |
| 0.9194444444444444 | 0 |
| 0.9201388888888888 | 0 |
| 0.9208333333333334 | 0 |
| 0.9215277777777778 | 0 |
| 0.9222222222222222 | 0 |
| 0.9229166666666666 | 0 |
| 0.9236111111111112 | 0 |
| 0.9243055555555556 | 0 |
| 0.9249999999999999 | 0 |
| 0.9256944444444444 | 0 |
| 0.9263888888888889 | 0 |
| 0.9270833333333334 | 0 |
| 0.9277777777777777 | 0 |
| 0.9284722222222223 | 0 |
| 0.9291666666666667 | 0 |
| 0.9298611111111111 | 0 |
| 0.9305555555555555 | 0 |
| 0.93125 | 0 |
| 0.9319444444444445 | 0 |
| 0.9326388888888889 | 0 |
| 0.9333333333333332 | 0 |
| 0.9340277777777778 | 0 |
| 0.9347222222222222 | 0 |
| 0.9354166666666667 | 0 |
| 0.936111111111111 | 0 |
| 0.9368055555555556 | 0 |
| 0.9375 | 0 |
| 0.9381944444444444 | 0 |
| 0.938888888888889 | 0 |
| 0.9395833333333333 | 0 |
| 0.9402777777777778 | 0 |
| 0.9409722222222222 | 0 |
| 0.9416666666666668 | 0 |
| 0.9423611111111111 | 0 |
| 0.9430555555555555 | 0 |
| 0.94375 | 0 |
| 0.9444444444444445 | 0 |
| 0.9451388888888889 | 0 |
| 0.9458333333333333 | 0 |
| 0.9465277777777777 | 0 |
| 0.9472222222222223 | 0 |
| 0.9479166666666666 | 0 |
| 0.9486111111111111 | 0 |
| 0.9493055555555556 | 0 |
| 0.9500000000000001 | 0 |
| 0.9506944444444444 | 0 |
| 0.9513888888888888 | 0 |
| 0.9520833333333334 | 0 |
| 0.9527777777777778 | 0 |
| 0.9534722222222222 | 0 |
| 0.9541666666666666 | 0 |
| 0.9548611111111112 | 0 |
| 0.9555555555555556 | 0 |
| 0.9562499999999999 | 0 |
| 0.9569444444444444 | 0 |
| 0.9576388888888889 | 0 |
| 0.9583333333333334 | 0 |
| 0.9590277777777777 | 0 |
| 0.9597222222222223 | 0 |
| 0.9604166666666667 | 0 |
| 0.9611111111111111 | 0 |
| 0.9618055555555555 | 0 |
| 0.9625 | 0 |
| 0.9631944444444445 | 0 |
| 0.9638888888888889 | 0 |
| 0.9645833333333332 | 0 |
| 0.9652777777777778 | 0 |
| 0.9659722222222222 | 0 |
| 0.9666666666666667 | 0 |
| 0.967361111111111 | 0 |
| 0.9680555555555556 | 0 |
| 0.96875 | 0 |
| 0.9694444444444444 | 0 |
| 0.970138888888889 | 0 |
| 0.9708333333333333 | 0 |
| 0.9715277777777778 | 0 |
| 0.9722222222222222 | 0 |
| 0.9729166666666668 | 0 |
| 0.9736111111111111 | 0 |
| 0.9743055555555555 | 0 |
| 0.975 | 0 |
| 0.9756944444444445 | 0 |
| 0.9763888888888889 | 0 |
| 0.9770833333333333 | 0 |
| 0.9777777777777777 | 0 |
| 0.9784722222222223 | 0 |
| 0.9791666666666666 | 0 |
| 0.9798611111111111 | 0 |
| 0.9805555555555556 | 0 |
| 0.9812500000000001 | 0 |
| 0.9819444444444444 | 0 |
| 0.9826388888888888 | 0 |
| 0.9833333333333334 | 0 |
| 0.9840277777777778 | 0 |
| 0.9847222222222222 | 0 |
| 0.9854166666666666 | 0 |
| 0.9861111111111112 | 0 |
| 0.9868055555555556 | 0 |
| 0.9874999999999999 | 0 |
| 0.9881944444444444 | 0 |
| 0.9888888888888889 | 0 |
| 0.9895833333333334 | 0 |
| 0.9902777777777777 | 0 |
| 0.9909722222222223 | 0 |
| 0.9916666666666667 | 0 |
| 0.9923611111111111 | 0 |
| 0.9930555555555555 | 0 |
| 0.99375 | 0 |
| 0.9944444444444445 | 0 |
| 0.9951388888888889 | 0 |
| 0.9958333333333332 | 0 |
| 0.9965277777777778 | 0 |
| 0.9972222222222222 | 0 |
| 0.9979166666666667 | 0 |
| 0.998611111111111 | 0 |
| 0.9993055555555556 | 0 |